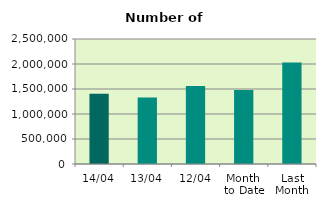
| Category | Series 0 |
|---|---|
| 14/04 | 1405486 |
| 13/04 | 1330666 |
| 12/04 | 1560800 |
| Month 
to Date | 1481539.2 |
| Last
Month | 2030137.913 |